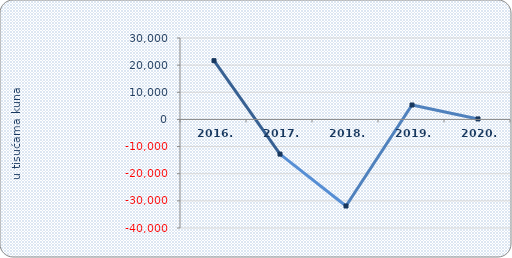
| Category | Neto dobit/gubitak |
|---|---|
| 2016. | 21645.629 |
| 2017. | -12778.951 |
| 2018. | -31896.409 |
| 2019. | 5318.394 |
| 2020. | 183.708 |